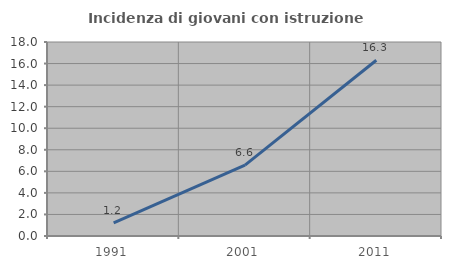
| Category | Incidenza di giovani con istruzione universitaria |
|---|---|
| 1991.0 | 1.21 |
| 2001.0 | 6.581 |
| 2011.0 | 16.304 |